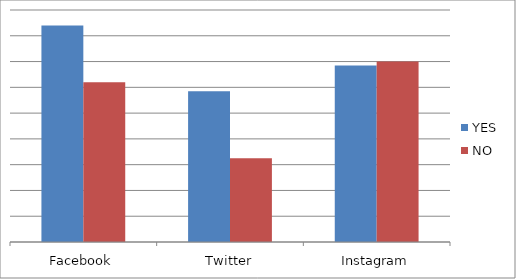
| Category | YES | NO |
|---|---|---|
| Facebook | 0.918 | 0.874 |
| Twitter | 0.867 | 0.815 |
| Instagram | 0.887 | 0.89 |